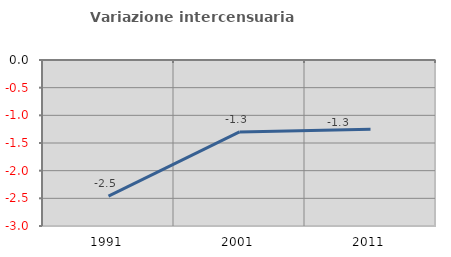
| Category | Variazione intercensuaria annua |
|---|---|
| 1991.0 | -2.461 |
| 2001.0 | -1.3 |
| 2011.0 | -1.251 |